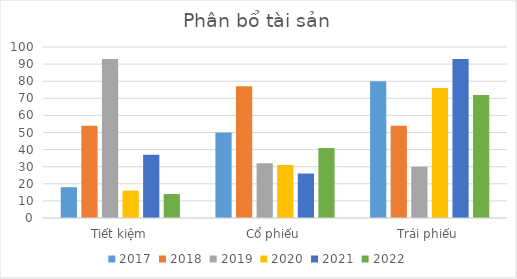
| Category | 2017 | 2018 | 2019 | 2020 | 2021 | 2022 |
|---|---|---|---|---|---|---|
| Tiết kiệm | 18 | 54 | 93 | 16 | 37 | 14 |
| Cổ phiếu | 50 | 77 | 32 | 31 | 26 | 41 |
| Trái phiếu | 80 | 54 | 30 | 76 | 93 | 72 |